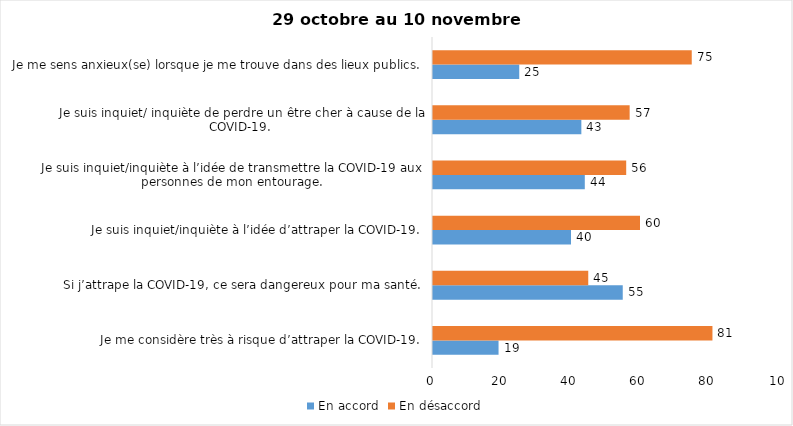
| Category | En accord | En désaccord |
|---|---|---|
| Je me considère très à risque d’attraper la COVID-19. | 19 | 81 |
| Si j’attrape la COVID-19, ce sera dangereux pour ma santé. | 55 | 45 |
| Je suis inquiet/inquiète à l’idée d’attraper la COVID-19. | 40 | 60 |
| Je suis inquiet/inquiète à l’idée de transmettre la COVID-19 aux personnes de mon entourage. | 44 | 56 |
| Je suis inquiet/ inquiète de perdre un être cher à cause de la COVID-19. | 43 | 57 |
| Je me sens anxieux(se) lorsque je me trouve dans des lieux publics. | 25 | 75 |